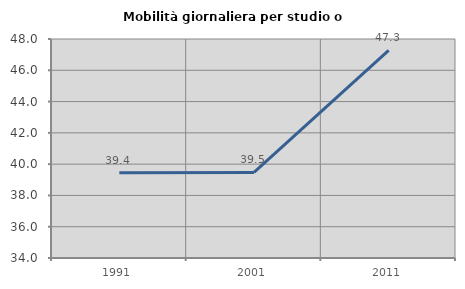
| Category | Mobilità giornaliera per studio o lavoro |
|---|---|
| 1991.0 | 39.446 |
| 2001.0 | 39.471 |
| 2011.0 | 47.271 |